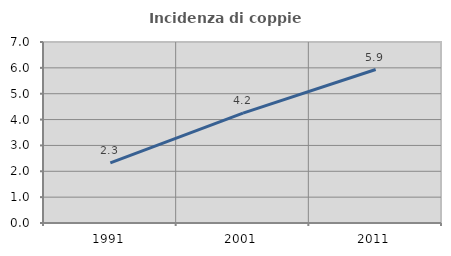
| Category | Incidenza di coppie miste |
|---|---|
| 1991.0 | 2.326 |
| 2001.0 | 4.248 |
| 2011.0 | 5.935 |